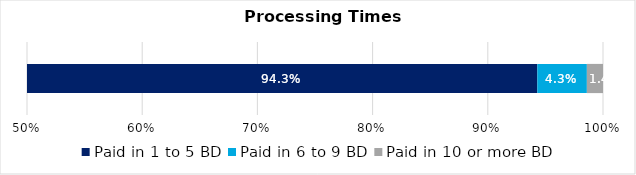
| Category | Paid in 1 to 5 BD | Paid in 6 to 9 BD | Paid in 10 or more BD |
|---|---|---|---|
| 0 | 0.943 | 0.043 | 0.014 |